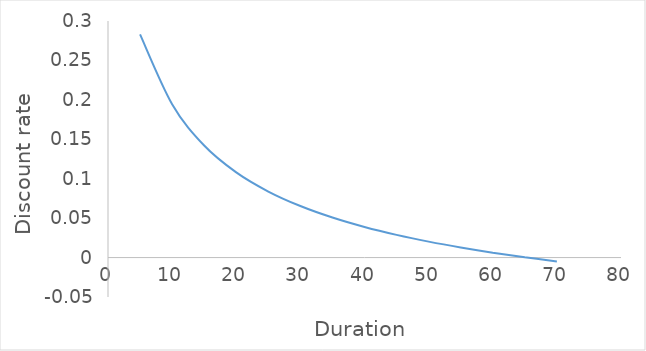
| Category | Series 0 |
|---|---|
| 5.0 | 0.283 |
| 10.0 | 0.195 |
| 15.0 | 0.142 |
| 20.0 | 0.108 |
| 25.0 | 0.084 |
| 30.0 | 0.065 |
| 35.0 | 0.051 |
| 40.0 | 0.039 |
| 45.0 | 0.029 |
| 50.0 | 0.02 |
| 55.0 | 0.013 |
| 60.0 | 0.006 |
| 65.0 | 0 |
| 70.0 | -0.005 |